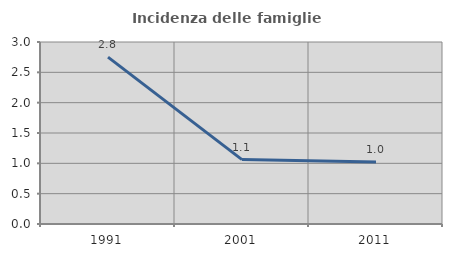
| Category | Incidenza delle famiglie numerose |
|---|---|
| 1991.0 | 2.75 |
| 2001.0 | 1.062 |
| 2011.0 | 1.02 |